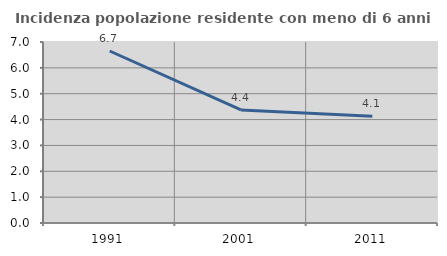
| Category | Incidenza popolazione residente con meno di 6 anni |
|---|---|
| 1991.0 | 6.652 |
| 2001.0 | 4.372 |
| 2011.0 | 4.124 |